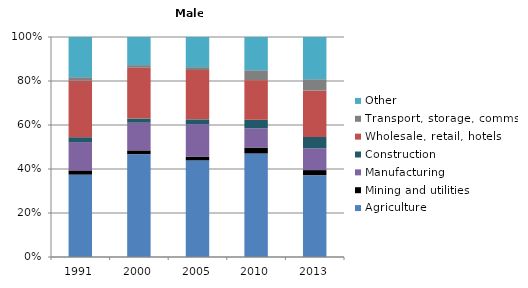
| Category | Agriculture | Mining and utilities | Manufacturing | Construction | Wholesale, retail, hotels | Transport, storage, comms | Other |
|---|---|---|---|---|---|---|---|
| 1991.0 | 37.5 | 1.9 | 12.9 | 2.2 | 25.7 | 1.6 | 18.3 |
| 2000.0 | 46.8 | 1.7 | 12.6 | 1.9 | 23.1 | 1.2 | 12.8 |
| 2005.0 | 43.9 | 1.7 | 14.7 | 2.2 | 22.4 | 1.3 | 13.7 |
| 2010.0 | 47 | 2.7 | 8.7 | 3.9 | 18 | 4.5 | 15.1 |
| 2013.0 | 37.2 | 2.3 | 9.9 | 5.2 | 21 | 5.2 | 19.2 |